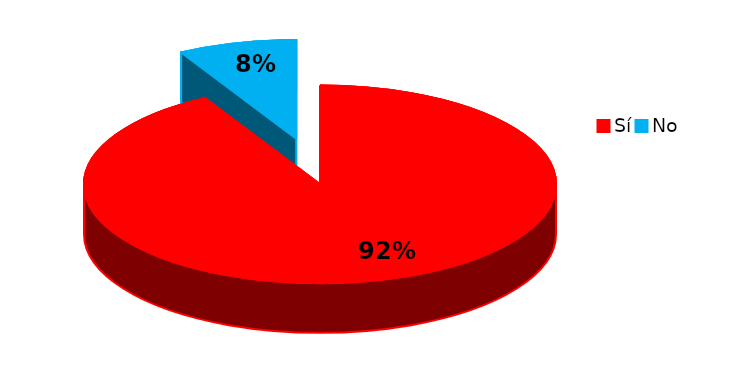
| Category | Series 0 |
|---|---|
| Sí | 238 |
| No | 21 |